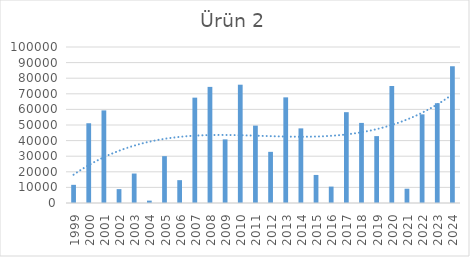
| Category | Ürün 2 |
|---|---|
| 1999.0 | 11644 |
| 2000.0 | 51119 |
| 2001.0 | 59353 |
| 2002.0 | 8895 |
| 2003.0 | 18884 |
| 2004.0 | 1531 |
| 2005.0 | 30035 |
| 2006.0 | 14643 |
| 2007.0 | 67531 |
| 2008.0 | 74431 |
| 2009.0 | 40788 |
| 2010.0 | 75832 |
| 2011.0 | 49612 |
| 2012.0 | 32794 |
| 2013.0 | 67718 |
| 2014.0 | 47836 |
| 2015.0 | 17986 |
| 2016.0 | 10515 |
| 2017.0 | 58222 |
| 2018.0 | 51342 |
| 2019.0 | 42874 |
| 2020.0 | 74994 |
| 2021.0 | 9161 |
| 2022.0 | 56824 |
| 2023.0 | 63968 |
| 2024.0 | 87667 |